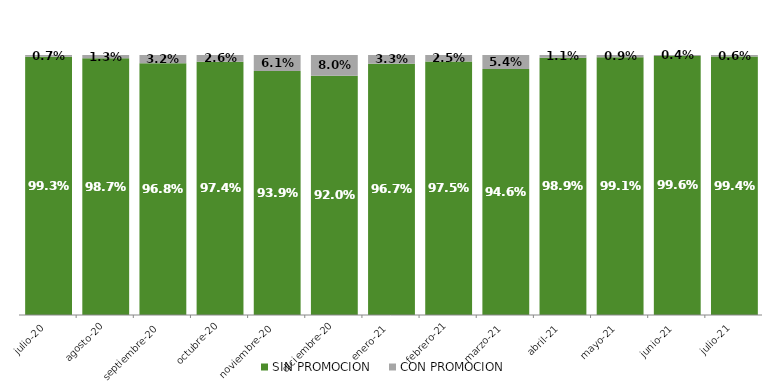
| Category | SIN PROMOCION   | CON PROMOCION   |
|---|---|---|
| 2020-07-01 | 0.993 | 0.007 |
| 2020-08-01 | 0.987 | 0.013 |
| 2020-09-01 | 0.968 | 0.032 |
| 2020-10-01 | 0.974 | 0.026 |
| 2020-11-01 | 0.939 | 0.061 |
| 2020-12-01 | 0.92 | 0.08 |
| 2021-01-01 | 0.967 | 0.033 |
| 2021-02-01 | 0.975 | 0.025 |
| 2021-03-01 | 0.946 | 0.054 |
| 2021-04-01 | 0.989 | 0.011 |
| 2021-05-01 | 0.991 | 0.009 |
| 2021-06-01 | 0.996 | 0.004 |
| 2021-07-01 | 0.994 | 0.006 |